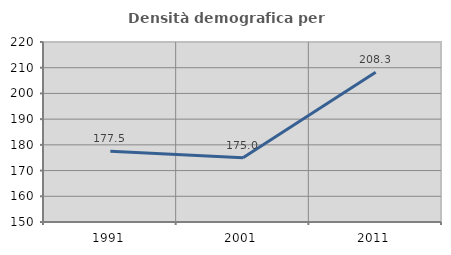
| Category | Densità demografica |
|---|---|
| 1991.0 | 177.522 |
| 2001.0 | 175.026 |
| 2011.0 | 208.262 |